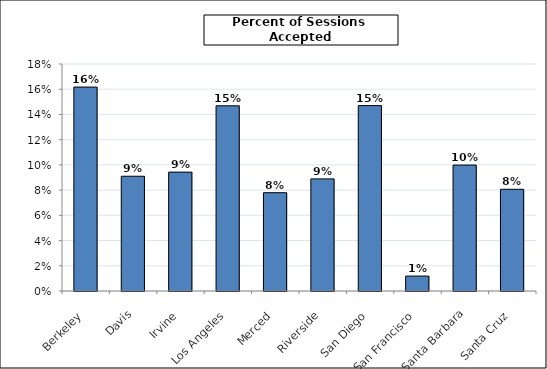
| Category | Sessions Accepted (by responding library) |
|---|---|
| Berkeley | 0.162 |
| Davis | 0.091 |
| Irvine | 0.094 |
| Los Angeles | 0.147 |
| Merced | 0.078 |
| Riverside | 0.089 |
| San Diego | 0.147 |
| San Francisco | 0.012 |
| Santa Barbara | 0.1 |
| Santa Cruz | 0.081 |